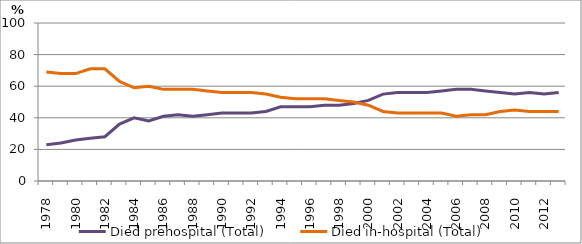
| Category | Died prehospital (Total) | Died in-hospital (Total) |
|---|---|---|
| 1978.0 | 23 | 69 |
| 1979.0 | 24 | 68 |
| 1980.0 | 26 | 68 |
| 1981.0 | 27 | 71 |
| 1982.0 | 28 | 71 |
| 1983.0 | 36 | 63 |
| 1984.0 | 40 | 59 |
| 1985.0 | 38 | 60 |
| 1986.0 | 41 | 58 |
| 1987.0 | 42 | 58 |
| 1988.0 | 41 | 58 |
| 1989.0 | 42 | 57 |
| 1990.0 | 43 | 56 |
| 1991.0 | 43 | 56 |
| 1992.0 | 43 | 56 |
| 1993.0 | 44 | 55 |
| 1994.0 | 47 | 53 |
| 1995.0 | 47 | 52 |
| 1996.0 | 47 | 52 |
| 1997.0 | 48 | 52 |
| 1998.0 | 48 | 51 |
| 1999.0 | 49 | 50 |
| 2000.0 | 51 | 48 |
| 2001.0 | 55 | 44 |
| 2002.0 | 56 | 43 |
| 2003.0 | 56 | 43 |
| 2004.0 | 56 | 43 |
| 2005.0 | 57 | 43 |
| 2006.0 | 58 | 41 |
| 2007.0 | 58 | 42 |
| 2008.0 | 57 | 42 |
| 2009.0 | 56 | 44 |
| 2010.0 | 55 | 45 |
| 2011.0 | 56 | 44 |
| 2012.0 | 55 | 44 |
| 2013.0 | 56 | 44 |